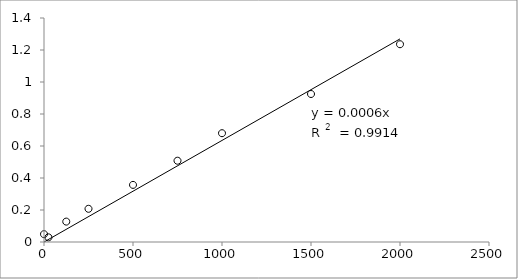
| Category | Series 0 |
|---|---|
| 2000.0 | 1.236 |
| 1500.0 | 0.925 |
| 1000.0 | 0.68 |
| 750.0 | 0.508 |
| 500.0 | 0.357 |
| 250.0 | 0.208 |
| 125.0 | 0.128 |
| 25.0 | 0.029 |
| 0.0 | 0.049 |